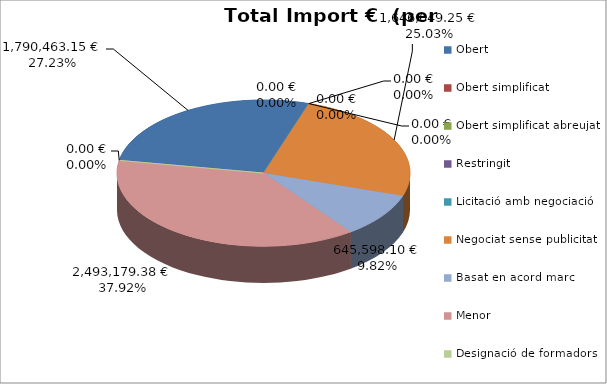
| Category | Total preu              (amb iva) |
|---|---|
| Obert | 1790463.146 |
| Obert simplificat | 0 |
| Obert simplificat abreujat | 0 |
| Restringit | 0 |
| Licitació amb negociació | 0 |
| Negociat sense publicitat | 1646049.25 |
| Basat en acord marc | 645598.1 |
| Menor | 2493179.38 |
| Designació de formadors | 0 |